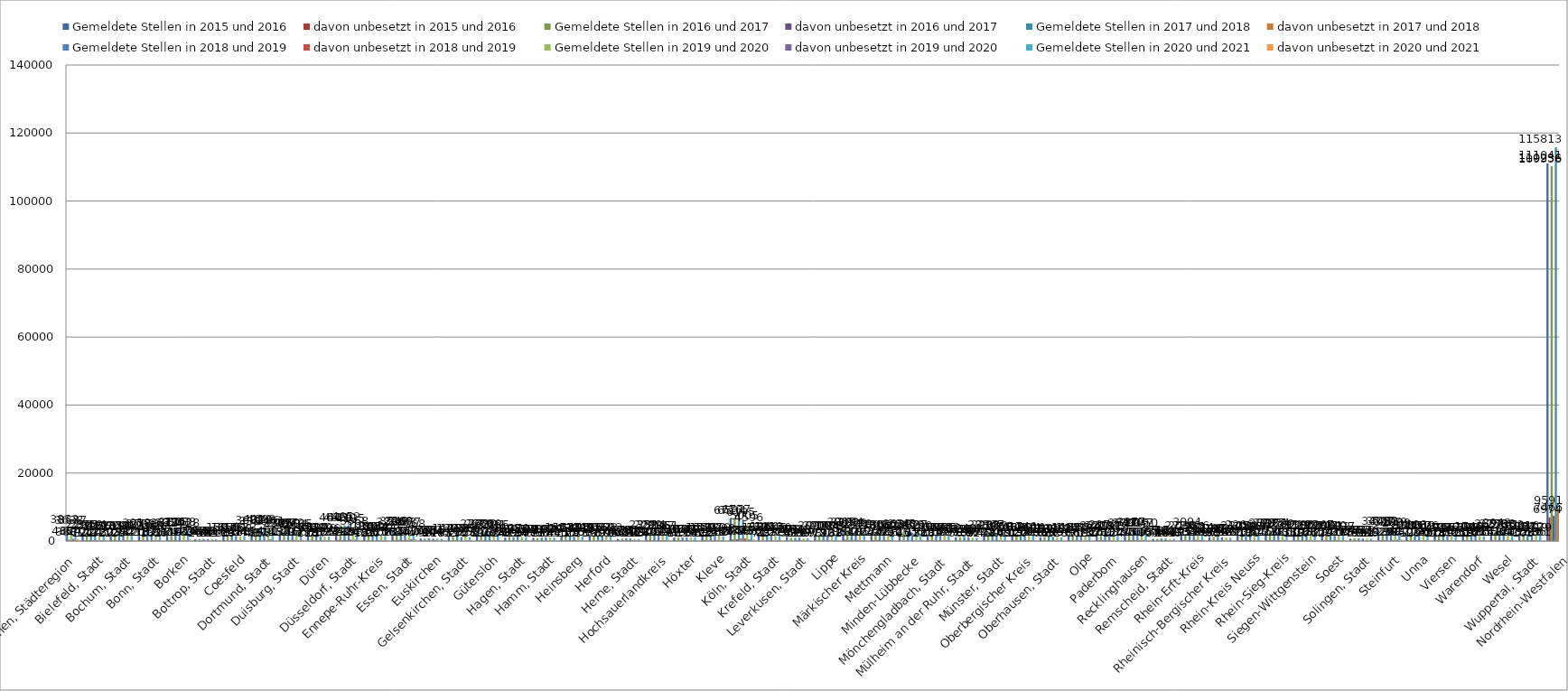
| Category | Gemeldete Stellen in 2015 und 2016 | davon unbesetzt in 2015 und 2016 | Gemeldete Stellen in 2016 und 2017 | davon unbesetzt in 2016 und 2017 | Gemeldete Stellen in 2017 und 2018 | davon unbesetzt in 2017 und 2018 | Gemeldete Stellen in 2018 und 2019 | davon unbesetzt in 2018 und 2019 | Gemeldete Stellen in 2019 und 2020 | davon unbesetzt in 2019 und 2020 | Gemeldete Stellen in 2020 und 2021 | davon unbesetzt in 2020 und 2021 |
|---|---|---|---|---|---|---|---|---|---|---|---|---|
| Aachen, Städteregion | 3610 | 377 | 3782 | 440 | 3837 | 436 | 3853 | 388 | 3638 | 624 | 3637 | 570 |
| Bielefeld, Stadt | 2294 | 124 | 2315 | 129 | 2359 | 210 | 2314 | 132 | 1856 | 245 | 1826 | 282 |
| Bochum, Stadt | 2135 | 203 | 2029 | 125 | 2114 | 198 | 2081 | 244 | 1950 | 212 | 2007 | 321 |
| Bonn, Stadt | 3018 | 218 | 2702 | 216 | 2778 | 162 | 2055 | 132 | 1926 | 193 | 1705 | 66 |
| Borken | 2817 | 184 | 2954 | 210 | 3115 | 247 | 3203 | 191 | 3088 | 233 | 2928 | 428 |
| Bottrop, Stadt | 545 | 20 | 564 | 42 | 618 | 58 | 566 | 42 | 566 | 81 | 517 | 117 |
| Coesfeld | 1597 | 93 | 1659 | 88 | 1576 | 141 | 1551 | 164 | 1460 | 185 | 1533 | 245 |
| Dortmund, Stadt | 3682 | 48 | 3388 | 85 | 4013 | 37 | 4038 | 58 | 3796 | 491 | 3451 | 145 |
| Duisburg, Stadt | 2909 | 137 | 2907 | 140 | 3050 | 345 | 2972 | 297 | 2684 | 156 | 2605 | 379 |
| Düren | 1544 | 118 | 1564 | 76 | 1587 | 117 | 1530 | 182 | 1336 | 155 | 1306 | 173 |
| Düsseldorf, Stadt | 4643 | 343 | 4629 | 259 | 4630 | 275 | 4652 | 426 | 4135 | 393 | 3368 | 348 |
| Ennepe-Ruhr-Kreis | 1955 | 127 | 1868 | 95 | 1809 | 96 | 1954 | 215 | 1630 | 207 | 1484 | 206 |
| Essen, Stadt | 3286 | 162 | 3549 | 319 | 3569 | 344 | 3083 | 341 | 3077 | 552 | 2768 | 530 |
| Euskirchen | 757 | 79 | 719 | 96 | 780 | 80 | 719 | 144 | 715 | 78 | 649 | 105 |
| Gelsenkirchen, Stadt | 1446 | 62 | 1282 | 39 | 1332 | 116 | 1226 | 72 | 1283 | 263 | 1206 | 253 |
| Gütersloh | 2762 | 89 | 2670 | 106 | 2730 | 103 | 2666 | 102 | 2301 | 255 | 2285 | 301 |
| Hagen, Stadt | 983 | 47 | 1205 | 69 | 1143 | 103 | 1370 | 124 | 1152 | 96 | 1179 | 199 |
| Hamm, Stadt | 938 | 35 | 913 | 11 | 1022 | 60 | 1074 | 58 | 1029 | 56 | 980 | 44 |
| Heinsberg | 1517 | 75 | 1458 | 115 | 1541 | 129 | 1300 | 176 | 1434 | 113 | 1311 | 159 |
| Herford | 1495 | 39 | 1509 | 38 | 1660 | 39 | 1554 | 50 | 1572 | 91 | 1692 | 95 |
| Herne, Stadt | 627 | 64 | 678 | 60 | 803 | 139 | 785 | 130 | 617 | 105 | 634 | 124 |
| Hochsauerlandkreis | 2352 | 189 | 2299 | 149 | 2314 | 167 | 2136 | 260 | 2137 | 224 | 2051 | 280 |
| Höxter | 1072 | 62 | 1054 | 105 | 1070 | 139 | 1041 | 110 | 1003 | 64 | 1091 | 95 |
| Kleve | 1500 | 122 | 1571 | 117 | 1597 | 166 | 1633 | 241 | 1610 | 268 | 1398 | 154 |
| Köln, Stadt | 6716 | 454 | 6534 | 539 | 6777 | 856 | 6195 | 753 | 5005 | 503 | 4596 | 450 |
| Krefeld, Stadt | 1580 | 71 | 1522 | 98 | 1866 | 223 | 1913 | 207 | 1645 | 179 | 1576 | 219 |
| Leverkusen, Stadt | 1181 | 55 | 976 | 47 | 962 | 111 | 1048 | 106 | 803 | 80 | 820 | 99 |
| Lippe | 2092 | 78 | 2010 | 73 | 2170 | 122 | 2004 | 93 | 1973 | 101 | 1849 | 88 |
| Märkischer Kreis | 3065 | 367 | 3303 | 282 | 3194 | 340 | 2829 | 337 | 2576 | 185 | 2413 | 264 |
| Mettmann | 2490 | 257 | 2309 | 295 | 2308 | 248 | 2460 | 299 | 1972 | 263 | 1988 | 252 |
| Minden-Lübbecke | 2630 | 105 | 2645 | 45 | 2382 | 101 | 2479 | 52 | 2327 | 152 | 2200 | 32 |
| Mönchengladbach, Stadt | 1618 | 68 | 1612 | 107 | 1596 | 156 | 1532 | 145 | 1585 | 177 | 1558 | 285 |
| Mülheim an der Ruhr, Stadt | 1112 | 58 | 1050 | 73 | 1242 | 134 | 1124 | 136 | 966 | 67 | 986 | 124 |
| Münster, Stadt | 2386 | 45 | 2288 | 33 | 2347 | 99 | 2213 | 84 | 1859 | 169 | 1706 | 69 |
| Oberbergischer Kreis | 1652 | 103 | 1546 | 120 | 1689 | 194 | 1746 | 273 | 1534 | 186 | 1616 | 226 |
| Oberhausen, Stadt | 1111 | 55 | 1185 | 83 | 1309 | 67 | 1303 | 186 | 1142 | 123 | 1121 | 156 |
| Olpe | 1488 | 33 | 1464 | 36 | 1610 | 70 | 1450 | 19 | 1558 | 131 | 1353 | 130 |
| Paderborn | 2249 | 173 | 2220 | 267 | 2272 | 213 | 2237 | 198 | 1735 | 124 | 1913 | 179 |
| Recklinghausen | 2947 | 150 | 2790 | 240 | 3277 | 250 | 3019 | 267 | 2947 | 310 | 3050 | 95 |
| Remscheid, Stadt | 635 | 51 | 653 | 76 | 717 | 89 | 744 | 109 | 634 | 86 | 624 | 93 |
| Rhein-Erft-Kreis | 2224 | 195 | 2038 | 164 | 3094 | 213 | 1981 | 339 | 2016 | 282 | 1614 | 368 |
| Rheinisch-Bergischer Kreis | 1158 | 97 | 1197 | 91 | 1223 | 154 | 1110 | 152 | 969 | 133 | 968 | 152 |
| Rhein-Kreis Neuss | 2145 | 173 | 2266 | 219 | 2254 | 226 | 1976 | 110 | 1839 | 164 | 1870 | 313 |
| Rhein-Sieg-Kreis | 2897 | 271 | 2992 | 250 | 3027 | 273 | 2854 | 203 | 2589 | 326 | 2391 | 138 |
| Siegen-Wittgenstein | 2116 | 119 | 2223 | 116 | 2396 | 195 | 2299 | 168 | 2027 | 187 | 1785 | 265 |
| Soest | 2267 | 129 | 2148 | 192 | 2080 | 141 | 2110 | 231 | 1912 | 160 | 1827 | 215 |
| Solingen, Stadt | 708 | 49 | 746 | 55 | 774 | 81 | 737 | 82 | 719 | 91 | 686 | 86 |
| Steinfurt | 3403 | 213 | 3507 | 225 | 3482 | 239 | 3199 | 298 | 3119 | 384 | 2809 | 417 |
| Unna | 2044 | 59 | 2015 | 129 | 2298 | 174 | 2117 | 160 | 2019 | 216 | 2176 | 207 |
| Viersen | 1452 | 118 | 1493 | 107 | 1716 | 119 | 1686 | 152 | 1553 | 142 | 1571 | 198 |
| Warendorf | 1700 | 118 | 1629 | 116 | 1745 | 148 | 1625 | 161 | 1481 | 185 | 1462 | 235 |
| Wesel | 2657 | 141 | 2753 | 156 | 2943 | 185 | 2738 | 261 | 2461 | 342 | 2353 | 293 |
| Wuppertal, Stadt | 1834 | 152 | 1854 | 103 | 2016 | 263 | 1872 | 239 | 1619 | 166 | 1579 | 161 |
| Nordrhein-Westfalen | 111041 | 6974 | 110236 | 7466 | 115813 | 9591 | 109956 | 10099 | 100579 | 10954 | 96071 | 11428 |